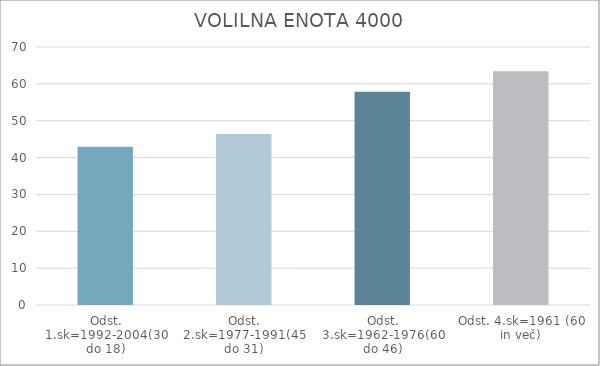
| Category | Series 0 |
|---|---|
| Odst. 1.sk=1992-2004(30 do 18) | 42.95 |
| Odst. 2.sk=1977-1991(45 do 31) | 46.37 |
| Odst. 3.sk=1962-1976(60 do 46) | 57.85 |
| Odst. 4.sk=1961 (60 in več) | 63.44 |